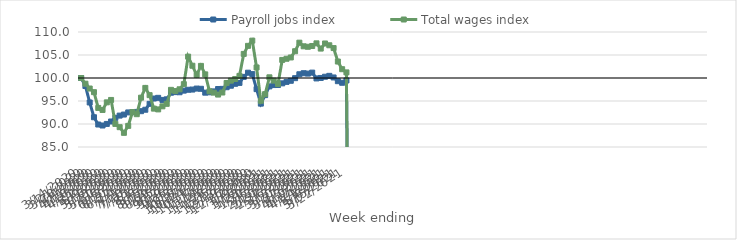
| Category | Payroll jobs index | Total wages index |
|---|---|---|
| 14/03/2020 | 100 | 100 |
| 21/03/2020 | 98.261 | 98.762 |
| 28/03/2020 | 94.681 | 97.712 |
| 04/04/2020 | 91.471 | 96.916 |
| 11/04/2020 | 89.886 | 93.496 |
| 18/04/2020 | 89.672 | 93.053 |
| 25/04/2020 | 90.016 | 94.706 |
| 02/05/2020 | 90.546 | 95.231 |
| 09/05/2020 | 91.34 | 90.019 |
| 16/05/2020 | 91.827 | 89.308 |
| 23/05/2020 | 92.054 | 88.079 |
| 30/05/2020 | 92.517 | 89.594 |
| 06/06/2020 | 92.568 | 92.582 |
| 13/06/2020 | 92.627 | 92.13 |
| 20/06/2020 | 92.787 | 95.723 |
| 27/06/2020 | 93.1 | 97.843 |
| 04/07/2020 | 94.384 | 96.273 |
| 11/07/2020 | 95.539 | 93.344 |
| 18/07/2020 | 95.687 | 93.173 |
| 25/07/2020 | 95.235 | 93.845 |
| 01/08/2020 | 95.361 | 94.379 |
| 08/08/2020 | 96.798 | 97.422 |
| 15/08/2020 | 96.93 | 97.16 |
| 22/08/2020 | 96.902 | 97.544 |
| 29/08/2020 | 97.253 | 98.658 |
| 05/09/2020 | 97.441 | 104.646 |
| 12/09/2020 | 97.487 | 102.665 |
| 19/09/2020 | 97.703 | 100.671 |
| 26/09/2020 | 97.655 | 102.633 |
| 03/10/2020 | 96.811 | 100.787 |
| 10/10/2020 | 96.893 | 97.118 |
| 17/10/2020 | 97.088 | 96.817 |
| 24/10/2020 | 97.606 | 96.397 |
| 31/10/2020 | 97.634 | 96.842 |
| 07/11/2020 | 97.997 | 98.915 |
| 14/11/2020 | 98.32 | 99.429 |
| 21/11/2020 | 98.737 | 99.784 |
| 28/11/2020 | 98.934 | 100.465 |
| 05/12/2020 | 100.243 | 105.24 |
| 12/12/2020 | 101.154 | 106.988 |
| 19/12/2020 | 100.847 | 108.12 |
| 26/12/2020 | 97.576 | 102.295 |
| 02/01/2021 | 94.428 | 95.051 |
| 09/01/2021 | 96.28 | 96.496 |
| 16/01/2021 | 98.179 | 100.147 |
| 23/01/2021 | 98.465 | 99.431 |
| 30/01/2021 | 98.48 | 98.711 |
| 06/02/2021 | 98.838 | 103.927 |
| 13/02/2021 | 99.152 | 104.182 |
| 20/02/2021 | 99.393 | 104.464 |
| 27/02/2021 | 99.964 | 105.82 |
| 06/03/2021 | 100.811 | 107.68 |
| 13/03/2021 | 101.04 | 106.894 |
| 20/03/2021 | 100.958 | 106.788 |
| 27/03/2021 | 101.17 | 106.957 |
| 03/04/2021 | 99.907 | 107.533 |
| 10/04/2021 | 100.008 | 106.396 |
| 17/04/2021 | 100.273 | 107.505 |
| 24/04/2021 | 100.469 | 107.113 |
| 01/05/2021 | 100.118 | 106.508 |
| 08/05/2021 | 99.309 | 103.577 |
| 15/05/2021 | 98.962 | 101.91 |
| 22/05/2021 | 99.459 | 101.218 |